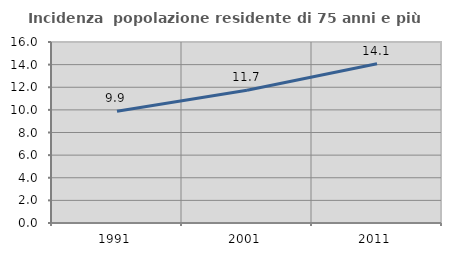
| Category | Incidenza  popolazione residente di 75 anni e più |
|---|---|
| 1991.0 | 9.886 |
| 2001.0 | 11.736 |
| 2011.0 | 14.074 |